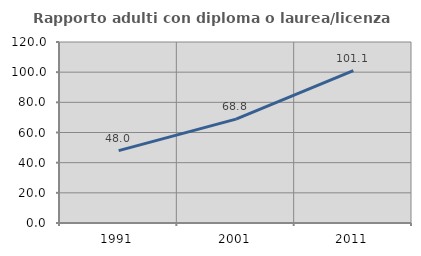
| Category | Rapporto adulti con diploma o laurea/licenza media  |
|---|---|
| 1991.0 | 48.016 |
| 2001.0 | 68.842 |
| 2011.0 | 101.067 |